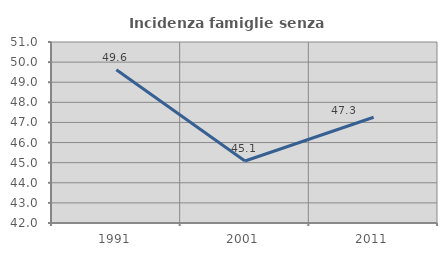
| Category | Incidenza famiglie senza nuclei |
|---|---|
| 1991.0 | 49.621 |
| 2001.0 | 45.082 |
| 2011.0 | 47.257 |